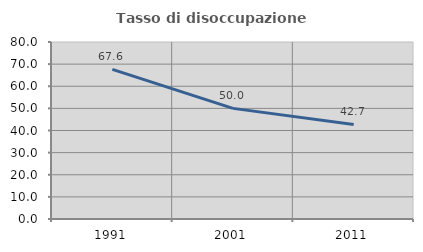
| Category | Tasso di disoccupazione giovanile  |
|---|---|
| 1991.0 | 67.63 |
| 2001.0 | 50 |
| 2011.0 | 42.718 |